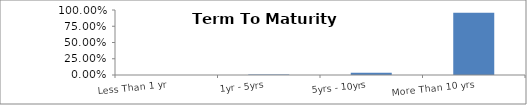
| Category | Series 0 |
|---|---|
| Less Than 1 yr | 0 |
| 1yr - 5yrs | 0.008 |
| 5yrs - 10yrs | 0.036 |
| More Than 10 yrs | 0.956 |